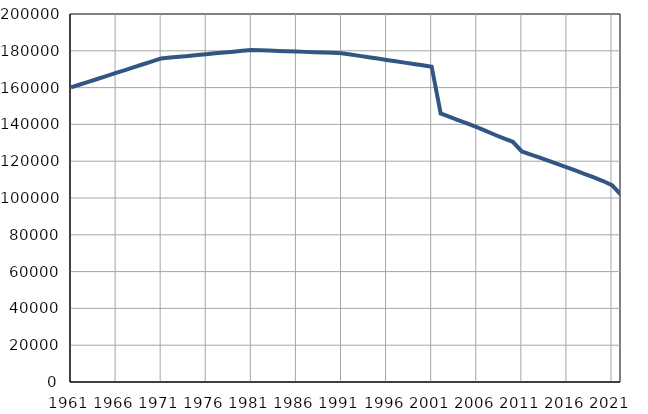
| Category | Population
size |
|---|---|
| 1961.0 | 160096 |
| 1962.0 | 161671 |
| 1963.0 | 163246 |
| 1964.0 | 164822 |
| 1965.0 | 166397 |
| 1966.0 | 167972 |
| 1967.0 | 169547 |
| 1968.0 | 171122 |
| 1969.0 | 172698 |
| 1970.0 | 174273 |
| 1971.0 | 175848 |
| 1972.0 | 176310 |
| 1973.0 | 176771 |
| 1974.0 | 177233 |
| 1975.0 | 177694 |
| 1976.0 | 178156 |
| 1977.0 | 178617 |
| 1978.0 | 179079 |
| 1979.0 | 179540 |
| 1980.0 | 180002 |
| 1981.0 | 180463 |
| 1982.0 | 180289 |
| 1983.0 | 180114 |
| 1984.0 | 179940 |
| 1985.0 | 179765 |
| 1986.0 | 179591 |
| 1987.0 | 179416 |
| 1988.0 | 179242 |
| 1989.0 | 179067 |
| 1990.0 | 178893 |
| 1991.0 | 178718 |
| 1992.0 | 177982 |
| 1993.0 | 177245 |
| 1994.0 | 176509 |
| 1995.0 | 175773 |
| 1996.0 | 175037 |
| 1997.0 | 174300 |
| 1998.0 | 173564 |
| 1999.0 | 172828 |
| 2000.0 | 172092 |
| 2001.0 | 171355 |
| 2002.0 | 145970 |
| 2003.0 | 144121 |
| 2004.0 | 142240 |
| 2005.0 | 140367 |
| 2006.0 | 138462 |
| 2007.0 | 136437 |
| 2008.0 | 134375 |
| 2009.0 | 132464 |
| 2010.0 | 130557 |
| 2011.0 | 125285 |
| 2012.0 | 123616 |
| 2013.0 | 121909 |
| 2014.0 | 120156 |
| 2015.0 | 118384 |
| 2016.0 | 116602 |
| 2017.0 | 114816 |
| 2018.0 | 113000 |
| 2019.0 | 111152 |
| 2020.0 | 109210 |
| 2021.0 | 106971 |
| 2022.0 | 101744 |